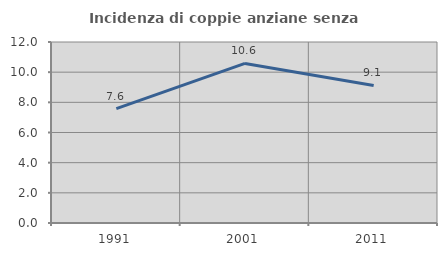
| Category | Incidenza di coppie anziane senza figli  |
|---|---|
| 1991.0 | 7.581 |
| 2001.0 | 10.58 |
| 2011.0 | 9.122 |